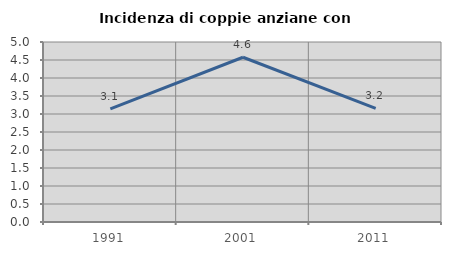
| Category | Incidenza di coppie anziane con figli |
|---|---|
| 1991.0 | 3.141 |
| 2001.0 | 4.577 |
| 2011.0 | 3.154 |